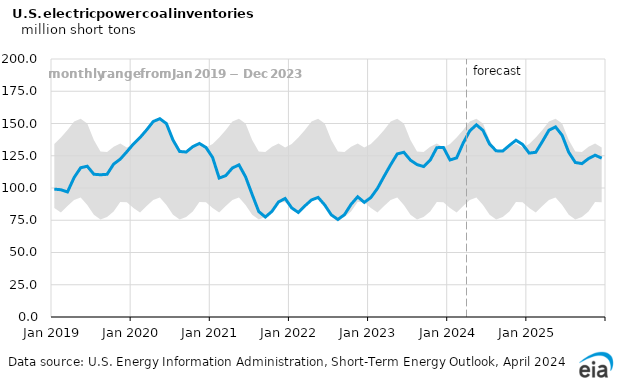
| Category | Electric Power Sector Coal Stocks |
|---|---|
| 0 | 99.145 |
| 1900-01-01 | 98.637 |
| 1900-01-02 | 96.932 |
| 1900-01-03 | 108.072 |
| 1900-01-04 | 115.7 |
| 1900-01-05 | 116.875 |
| 1900-01-06 | 110.661 |
| 1900-01-07 | 110.268 |
| 1900-01-08 | 110.615 |
| 1900-01-09 | 118.566 |
| 1900-01-10 | 122.357 |
| 1900-01-11 | 128.102 |
| 1900-01-12 | 134.134 |
| 1900-01-13 | 139.112 |
| 1900-01-14 | 145.034 |
| 1900-01-15 | 151.534 |
| 1900-01-16 | 153.716 |
| 1900-01-17 | 149.935 |
| 1900-01-18 | 137.149 |
| 1900-01-19 | 128.33 |
| 1900-01-20 | 127.902 |
| 1900-01-21 | 132.058 |
| 1900-01-22 | 134.522 |
| 1900-01-23 | 131.431 |
| 1900-01-24 | 123.705 |
| 1900-01-25 | 107.698 |
| 1900-01-26 | 109.614 |
| 1900-01-27 | 115.505 |
| 1900-01-28 | 117.932 |
| 1900-01-29 | 108.678 |
| 1900-01-30 | 94.974 |
| 1900-01-31 | 81.762 |
| 1900-02-01 | 77.476 |
| 1900-02-02 | 81.88 |
| 1900-02-03 | 89.192 |
| 1900-02-04 | 91.884 |
| 1900-02-05 | 84.541 |
| 1900-02-06 | 81.034 |
| 1900-02-07 | 86.143 |
| 1900-02-08 | 90.746 |
| 1900-02-09 | 92.692 |
| 1900-02-10 | 86.869 |
| 1900-02-11 | 79.172 |
| 1900-02-12 | 75.57 |
| 1900-02-13 | 79.354 |
| 1900-02-14 | 87.342 |
| 1900-02-15 | 93.203 |
| 1900-02-16 | 88.861 |
| 1900-02-17 | 92.604 |
| 1900-02-18 | 99.7 |
| 1900-02-19 | 109.004 |
| 1900-02-20 | 118.035 |
| 1900-02-21 | 126.414 |
| 1900-02-22 | 127.71 |
| 1900-02-23 | 121.59 |
| 1900-02-24 | 118.144 |
| 1900-02-25 | 116.635 |
| 1900-02-26 | 121.621 |
| 1900-02-27 | 131.266 |
| 1900-02-28 | 131.426 |
| 1900-02-28 | 121.722 |
| 1900-03-01 | 123.331 |
| 1900-03-02 | 134.882 |
| 1900-03-03 | 144.322 |
| 1900-03-04 | 148.98 |
| 1900-03-05 | 144.638 |
| 1900-03-06 | 134.035 |
| 1900-03-07 | 128.796 |
| 1900-03-08 | 128.694 |
| 1900-03-09 | 133.014 |
| 1900-03-10 | 137.023 |
| 1900-03-11 | 133.796 |
| 1900-03-12 | 127.044 |
| 1900-03-13 | 127.667 |
| 1900-03-14 | 135.974 |
| 1900-03-15 | 144.763 |
| 1900-03-16 | 147.361 |
| 1900-03-17 | 140.834 |
| 1900-03-18 | 127.683 |
| 1900-03-19 | 119.781 |
| 1900-03-20 | 118.906 |
| 1900-03-21 | 122.768 |
| 1900-03-22 | 125.441 |
| 1900-03-23 | 123.126 |